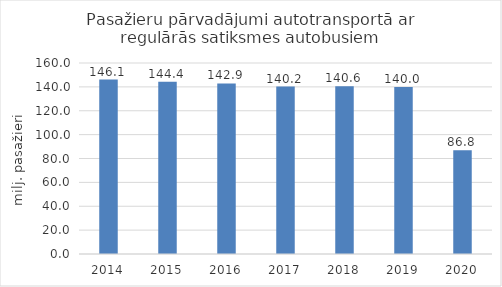
| Category | Series 0 |
|---|---|
| 2014.0 | 146.114 |
| 2015.0 | 144.374 |
| 2016.0 | 142.871 |
| 2017.0 | 140.249 |
| 2018.0 | 140.583 |
| 2019.0 | 139.955 |
| 2020.0 | 86.825 |